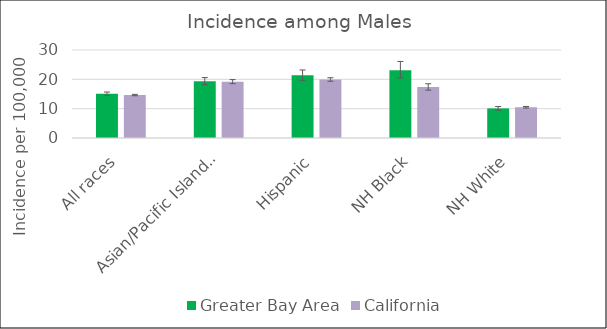
| Category | Greater Bay Area | California | SEER 18 |
|---|---|---|---|
| All races | 15.11 | 14.63 |  |
| Asian/Pacific Islander | 19.35 | 19.2 |  |
| Hispanic | 21.38 | 19.94 |  |
| NH Black | 23.13 | 17.37 |  |
| NH White | 10.09 | 10.48 |  |